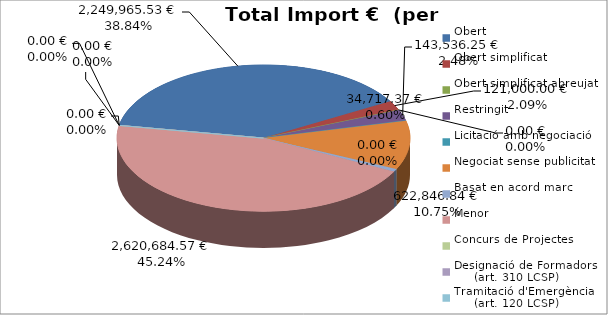
| Category | Total preu
(amb IVA) |
|---|---|
| Obert | 2249965.53 |
| Obert simplificat | 121000 |
| Obert simplificat abreujat | 0 |
| Restringit | 143536.25 |
| Licitació amb negociació | 0 |
| Negociat sense publicitat | 622846.84 |
| Basat en acord marc | 34717.37 |
| Menor | 2620684.57 |
| Concurs de Projectes | 0 |
| Designació de Formadors
     (art. 310 LCSP) | 0 |
| Tramitació d'Emergència
     (art. 120 LCSP) | 0 |